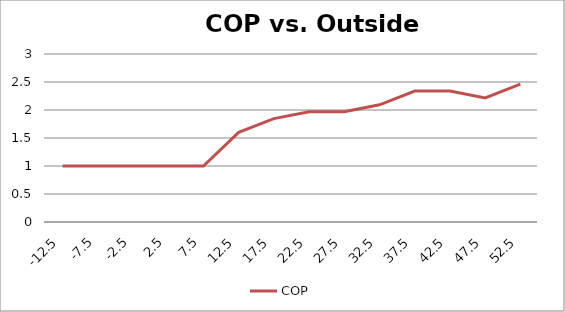
| Category | COP |
|---|---|
| -12.5 | 1 |
| -7.5 | 1 |
| -2.5 | 1 |
| 2.5 | 1 |
| 7.5 | 1 |
| 12.5 | 1.6 |
| 17.5 | 1.846 |
| 22.5 | 1.969 |
| 27.5 | 1.969 |
| 32.5 | 2.092 |
| 37.5 | 2.338 |
| 42.5 | 2.338 |
| 47.5 | 2.215 |
| 52.5 | 2.462 |